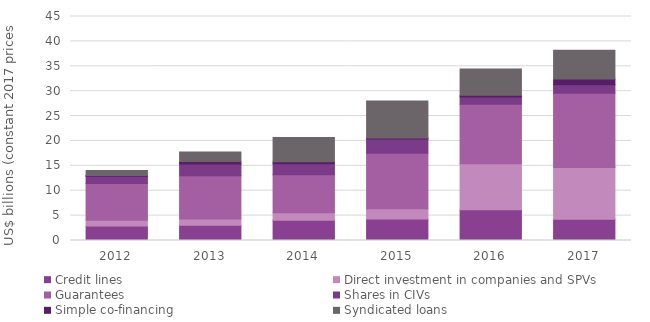
| Category | Credit lines | Direct investment in companies and SPVs | Guarantees | Shares in CIVs | Simple co-financing | Syndicated loans |
|---|---|---|---|---|---|---|
| 2012.0 | 2896.245 | 1149.427 | 7388.635 | 1496.605 | 140.731 | 1009.575 |
| 2013.0 | 3039.26 | 1276.909 | 8679.407 | 2368.838 | 511.681 | 1882.766 |
| 2014.0 | 4052.401 | 1532.759 | 7629.198 | 2216.838 | 401.927 | 4880.435 |
| 2015.0 | 4308.702 | 2076.115 | 11166.06 | 2839.485 | 192.465 | 7440.402 |
| 2016.0 | 6159.184 | 9274.74 | 11946.284 | 1465.087 | 340.266 | 5287.032 |
| 2017.0 | 4276.662 | 10413.215 | 14886.918 | 1714.991 | 1137.812 | 5812.964 |